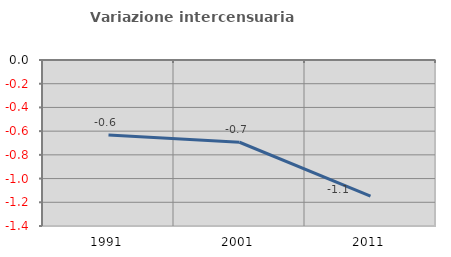
| Category | Variazione intercensuaria annua |
|---|---|
| 1991.0 | -0.633 |
| 2001.0 | -0.694 |
| 2011.0 | -1.148 |